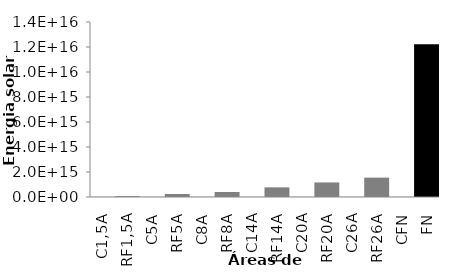
| Category | Series 0 |
|---|---|
| C1,5A | 47553660000000 |
| RF1,5A | 71339762963700 |
| C5A | 47553660000000 |
| RF5A | 241425380255400 |
| C8A | 47553660000000 |
| RF8A | 400972406772960 |
| C14A | 47553660000000 |
| RF14A | 771387510967920.1 |
| C20A | 47553660000000 |
| RF20A | 1164261556616399.8 |
| C26A | 47553660000000 |
| RF26A | 1550400319250639.8 |
| CFN | 47553660000000 |
| FN | 12228084000000000 |